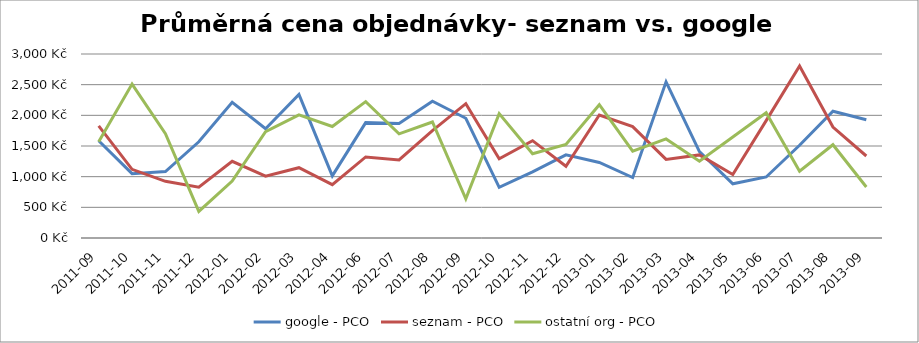
| Category | google - PCO | seznam - PCO | ostatní org - PCO |
|---|---|---|---|
| 2011-09 | 1586.441 | 1828.956 | 1570.979 |
| 2011-10 | 1049.525 | 1119.108 | 2509.654 |
| 2011-11 | 1083.744 | 923.663 | 1701.486 |
| 2011-12 | 1569.324 | 829.335 | 433.322 |
| 2012-01 | 2213.501 | 1250.312 | 928.518 |
| 2012-02 | 1782.4 | 1009.121 | 1732.52 |
| 2012-03 | 2340.903 | 1146.059 | 2008.562 |
| 2012-04 | 1012.903 | 869.697 | 1817.697 |
| 2012-06 | 1881.807 | 1321.647 | 2223.203 |
| 2012-07 | 1867.923 | 1272.867 | 1699.061 |
| 2012-08 | 2231.018 | 1749.77 | 1891.398 |
| 2012-09 | 1951.815 | 2189.992 | 639.825 |
| 2012-10 | 825.74 | 1292.443 | 2027.75 |
| 2012-11 | 1079.005 | 1587.022 | 1373.194 |
| 2012-12 | 1355.97 | 1168.841 | 1525.496 |
| 2013-01 | 1231.799 | 2005.213 | 2173.485 |
| 2013-02 | 986.241 | 1815.872 | 1415.123 |
| 2013-03 | 2546.482 | 1281.526 | 1614.958 |
| 2013-04 | 1407.98 | 1354.658 | 1252.95 |
| 2013-05 | 884.145 | 1034.33 | 1645.92 |
| 2013-06 | 994.814 | 1914.083 | 2041.775 |
| 2013-07 | 1511.597 | 2804.498 | 1090.042 |
| 2013-08 | 2065.975 | 1808.998 | 1521.201 |
| 2013-09 | 1928.817 | 1337.075 | 831.769 |